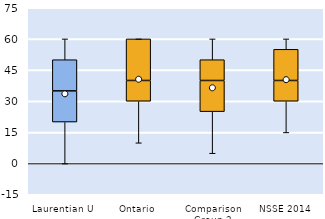
| Category | 25th | 50th | 75th |
|---|---|---|---|
| Laurentian U | 20 | 15 | 15 |
| Ontario | 30 | 10 | 20 |
| Comparison Group 2 | 25 | 15 | 10 |
| NSSE 2014 | 30 | 10 | 15 |